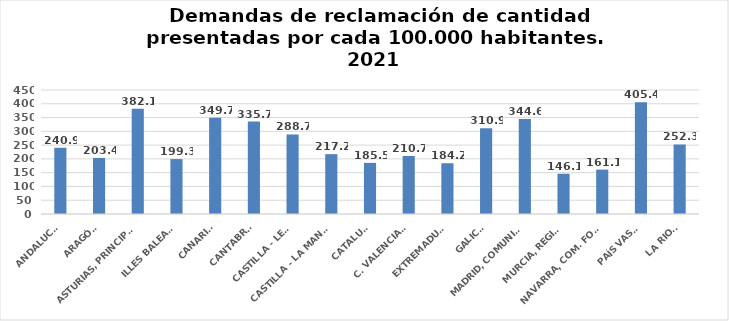
| Category | Series 0 |
|---|---|
| ANDALUCÍA | 240.853 |
| ARAGÓN | 203.429 |
| ASTURIAS, PRINCIPADO | 382.094 |
| ILLES BALEARS | 199.317 |
| CANARIAS | 349.71 |
| CANTABRIA | 335.667 |
| CASTILLA - LEÓN | 288.653 |
| CASTILLA - LA MANCHA | 217.217 |
| CATALUÑA | 185.525 |
| C. VALENCIANA | 210.69 |
| EXTREMADURA | 184.238 |
| GALICIA | 310.872 |
| MADRID, COMUNIDAD | 344.573 |
| MURCIA, REGIÓN | 146.067 |
| NAVARRA, COM. FORAL | 161.14 |
| PAÍS VASCO | 405.421 |
| LA RIOJA | 252.348 |